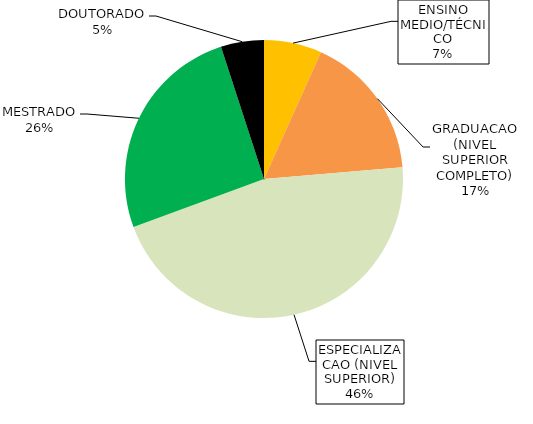
| Category | Series 0 |
|---|---|
| ENSINO MEDIO/TÉCNICO | 0.067 |
| GRADUACAO (NIVEL SUPERIOR COMPLETO) | 0.17 |
| ESPECIALIZACAO (NIVEL SUPERIOR) | 0.457 |
| MESTRADO | 0.256 |
| DOUTORADO | 0.05 |